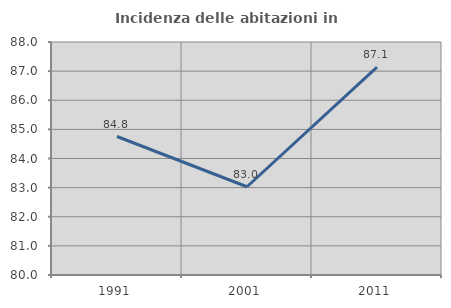
| Category | Incidenza delle abitazioni in proprietà  |
|---|---|
| 1991.0 | 84.755 |
| 2001.0 | 83.03 |
| 2011.0 | 87.14 |